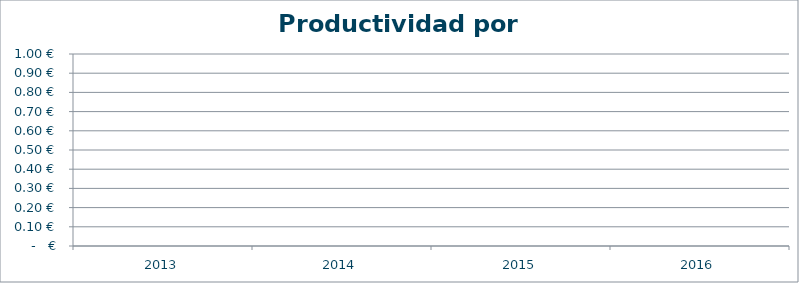
| Category | Productividad por trabajador |
|---|---|
| 2013.0 | 0 |
| 2014.0 | 0 |
| 2015.0 | 0 |
| 2016.0 | 0 |